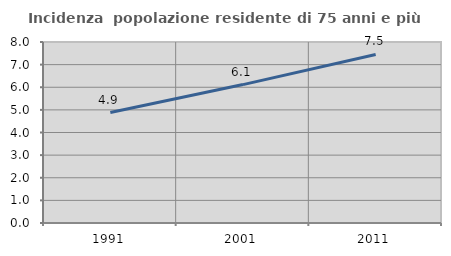
| Category | Incidenza  popolazione residente di 75 anni e più |
|---|---|
| 1991.0 | 4.881 |
| 2001.0 | 6.118 |
| 2011.0 | 7.45 |